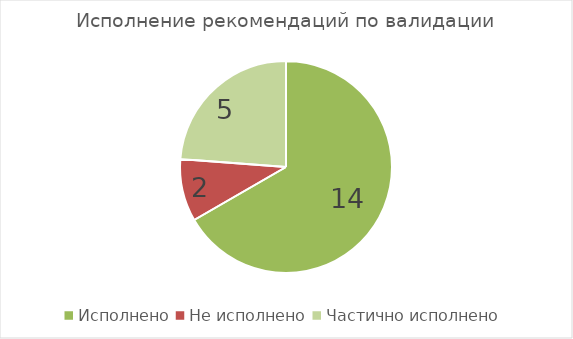
| Category | Series 0 |
|---|---|
| Исполнено | 14 |
| Не исполнено | 2 |
| Частично исполнено | 5 |